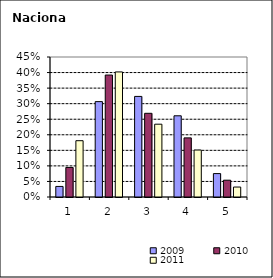
| Category | 2009 | 2010 | 2011 |
|---|---|---|---|
| 1.0 | 0.034 | 0.095 | 0.181 |
| 2.0 | 0.307 | 0.392 | 0.402 |
| 3.0 | 0.323 | 0.269 | 0.234 |
| 4.0 | 0.261 | 0.19 | 0.151 |
| 5.0 | 0.075 | 0.054 | 0.032 |